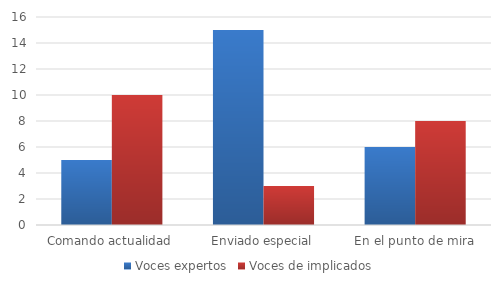
| Category | Voces expertos | Voces de implicados |
|---|---|---|
| Comando actualidad | 5 | 10 |
| Enviado especial | 15 | 3 |
| En el punto de mira | 6 | 8 |